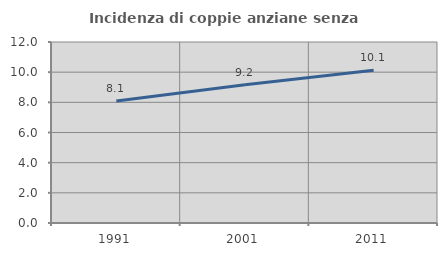
| Category | Incidenza di coppie anziane senza figli  |
|---|---|
| 1991.0 | 8.095 |
| 2001.0 | 9.169 |
| 2011.0 | 10.13 |